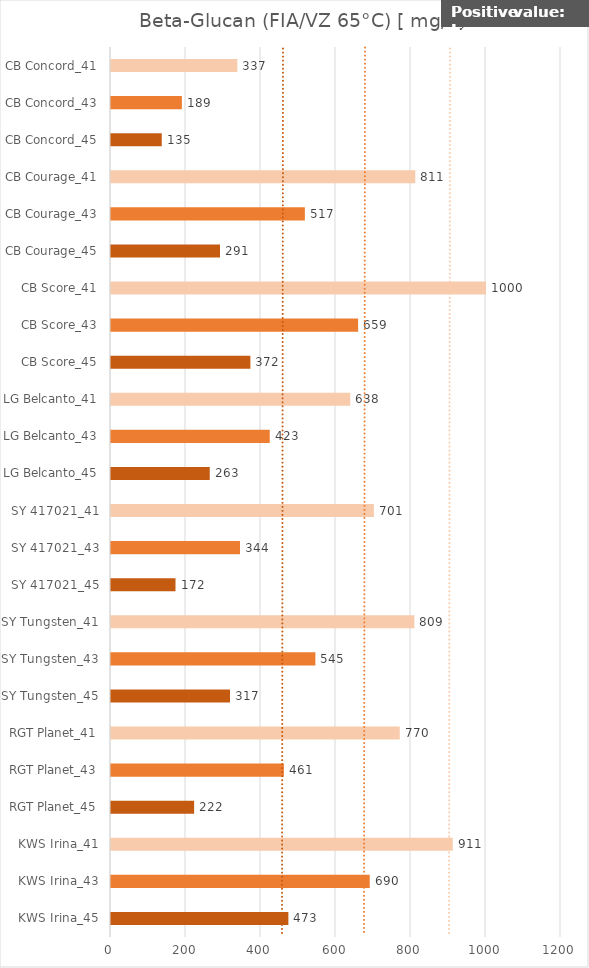
| Category |    Beta-Glucan (FIA/VZ 65°C) [ mg/l ] |
|---|---|
| KWS Irina_45 | 473 |
| KWS Irina_43 | 690 |
| KWS Irina_41 | 911.333 |
| RGT Planet_45 | 221.667 |
| RGT Planet_43 | 461 |
| RGT Planet_41 | 770 |
| SY Tungsten_45 | 317.333 |
| SY Tungsten_43 | 545 |
| SY Tungsten_41 | 809 |
| SY 417021_45 | 172 |
| SY 417021_43 | 344 |
| SY 417021_41 | 701 |
| LG Belcanto_45 | 263.333 |
| LG Belcanto_43 | 423.333 |
| LG Belcanto_41 | 638 |
| CB Score_45 | 371.667 |
| CB Score_43 | 659 |
| CB Score_41 | 1000 |
| CB Courage_45 | 290.667 |
| CB Courage_43 | 517 |
| CB Courage_41 | 811.333 |
| CB Concord_45 | 135.333 |
| CB Concord_43 | 189 |
| CB Concord_41 | 337 |